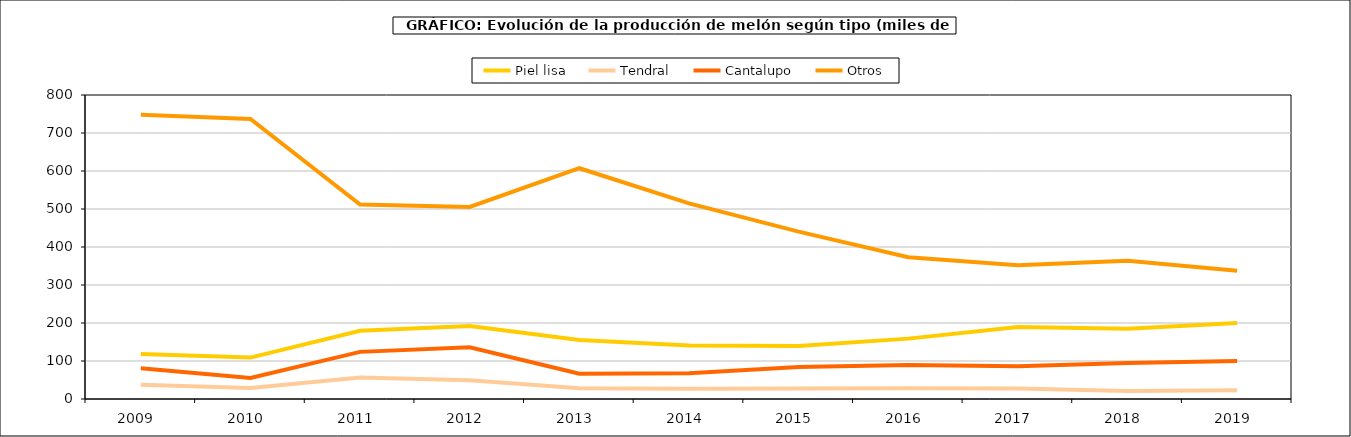
| Category | Piel lisa | Tendral | Cantalupo | Otros |
|---|---|---|---|---|
| 2009.0 | 118.315 | 37.372 | 81.013 | 748.086 |
| 2010.0 | 108.94 | 28.98 | 55.599 | 737.036 |
| 2011.0 | 179.519 | 56.591 | 124.015 | 511.871 |
| 2012.0 | 191.896 | 49.169 | 136.333 | 505.471 |
| 2013.0 | 155.121 | 28.073 | 66.453 | 607.304 |
| 2014.0 | 140.682 | 27.23 | 67.816 | 514.864 |
| 2015.0 | 139.486 | 27.748 | 84.305 | 440.517 |
| 2016.0 | 158.886 | 28.45 | 89.425 | 373.006 |
| 2017.0 | 189.59 | 27.88 | 86.499 | 351.708 |
| 2018.0 | 184.675 | 21.163 | 94.594 | 363.921 |
| 2019.0 | 199.826 | 22.833 | 100.181 | 337.351 |